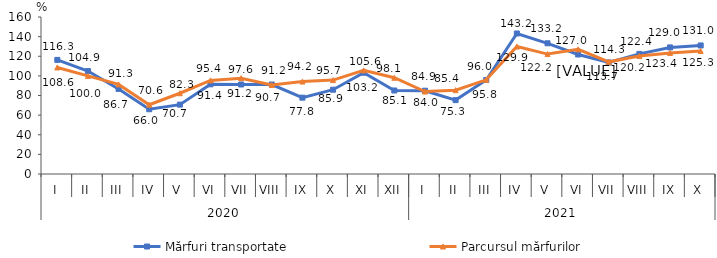
| Category | Mărfuri transportate | Parcursul mărfurilor |
|---|---|---|
| 0 | 116.3 | 108.6 |
| 1 | 104.9 | 100 |
| 2 | 86.7 | 91.3 |
| 3 | 66 | 70.6 |
| 4 | 70.7 | 82.3 |
| 5 | 91.4 | 95.4 |
| 6 | 91.2 | 97.6 |
| 7 | 91.2 | 90.7 |
| 8 | 77.8 | 94.2 |
| 9 | 85.9 | 95.7 |
| 10 | 103.2 | 105.6 |
| 11 | 85.1 | 98.1 |
| 12 | 84.9 | 84 |
| 13 | 75.3 | 85.4 |
| 14 | 95.8 | 96 |
| 15 | 143.2 | 129.9 |
| 16 | 133.2 | 122.2 |
| 17 | 121.8 | 127 |
| 18 | 113.7 | 114.3 |
| 19 | 122.4 | 120.2 |
| 20 | 129 | 123.4 |
| 21 | 131 | 125.3 |